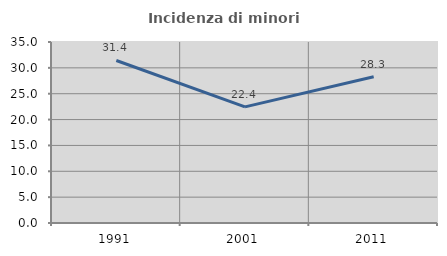
| Category | Incidenza di minori stranieri |
|---|---|
| 1991.0 | 31.429 |
| 2001.0 | 22.449 |
| 2011.0 | 28.289 |